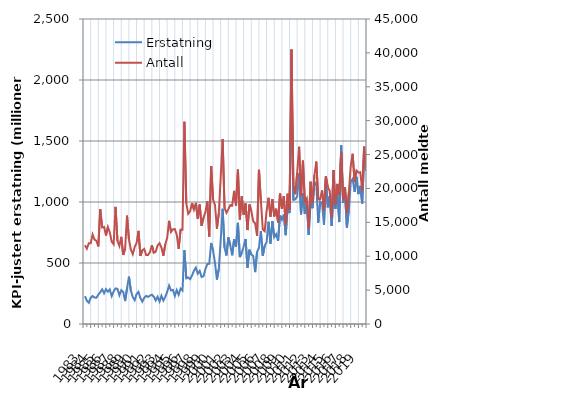
| Category | Erstatning |
|---|---|
| 1983.0 | 227.964 |
| nan | 190.955 |
| nan | 174.628 |
| nan | 213.912 |
| 1984.0 | 229.384 |
| nan | 216.981 |
| nan | 215.133 |
| nan | 240.627 |
| 1985.0 | 260.029 |
| nan | 284.219 |
| nan | 251.852 |
| nan | 285.634 |
| 1986.0 | 264.826 |
| nan | 283.375 |
| nan | 228.079 |
| nan | 266.905 |
| 1987.0 | 291.588 |
| nan | 287.744 |
| nan | 235.473 |
| nan | 277.041 |
| 1988.0 | 263.687 |
| nan | 187.968 |
| nan | 292.765 |
| nan | 387.832 |
| 1989.0 | 273.994 |
| nan | 221.453 |
| nan | 194.861 |
| nan | 245.838 |
| 1990.0 | 263.228 |
| nan | 211.767 |
| nan | 183.659 |
| nan | 213.772 |
| 1991.0 | 230.68 |
| nan | 221.798 |
| nan | 232.127 |
| nan | 239.99 |
| 1992.0 | 224.195 |
| nan | 193.179 |
| nan | 223.213 |
| nan | 184.195 |
| 1993.0 | 231.114 |
| nan | 192.338 |
| nan | 222.213 |
| nan | 262.884 |
| 1994.0 | 314.862 |
| nan | 275.261 |
| nan | 279.662 |
| nan | 230.511 |
| 1995.0 | 277.717 |
| nan | 238.919 |
| nan | 290.312 |
| nan | 275.636 |
| 1996.0 | 604.469 |
| nan | 374.297 |
| nan | 380.984 |
| nan | 367.429 |
| 1997.0 | 397.775 |
| nan | 436.49 |
| nan | 462.248 |
| nan | 412.432 |
| 1998.0 | 435.106 |
| nan | 385.462 |
| nan | 391.76 |
| nan | 450.284 |
| 1999.0 | 491.13 |
| nan | 493.516 |
| nan | 664.088 |
| nan | 601.42 |
| 2000.0 | 501.324 |
| nan | 364.071 |
| nan | 451.345 |
| nan | 688.162 |
| 2001.0 | 944.423 |
| nan | 625.212 |
| nan | 561.523 |
| nan | 710.442 |
| 2002.0 | 647.039 |
| nan | 562.987 |
| nan | 695.755 |
| nan | 633.988 |
| 2003.0 | 829.17 |
| nan | 548.217 |
| nan | 583.233 |
| nan | 635.347 |
| 2004.0 | 697.01 |
| nan | 460.816 |
| nan | 609.217 |
| nan | 569.431 |
| 2005.0 | 557.333 |
| nan | 425.322 |
| nan | 590.463 |
| nan | 625.742 |
| 2006.0 | 760.6 |
| nan | 557.795 |
| nan | 641.812 |
| nan | 669.588 |
| 2007.0 | 838.122 |
| nan | 658.941 |
| nan | 841.908 |
| nan | 711.817 |
| 2008.0 | 736.112 |
| nan | 681.454 |
| nan | 890.019 |
| nan | 854.771 |
| 2009.0 | 896.987 |
| nan | 728.211 |
| nan | 961.947 |
| nan | 909.241 |
| 2010.0 | 1994.506 |
| nan | 1017.297 |
| nan | 1022.191 |
| nan | 1045.745 |
| 2011.0 | 1235.879 |
| nan | 898.702 |
| nan | 1071.564 |
| nan | 903.076 |
| 2012.0 | 1000.485 |
| nan | 731.446 |
| nan | 1008.459 |
| nan | 949.56 |
| 2013.0 | 1166.159 |
| nan | 1141.89 |
| nan | 830.891 |
| nan | 1003.62 |
| 2014.0 | 989.839 |
| nan | 812.853 |
| nan | 1195.75 |
| nan | 956.074 |
| 2015.0 | 1048.937 |
| nan | 803.302 |
| nan | 1063.343 |
| nan | 944.127 |
| 2016.0 | 1085.348 |
| nan | 835.433 |
| nan | 1465.2 |
| nan | 994.139 |
| 2017.0 | 1065.703 |
| nan | 790.406 |
| nan | 933.477 |
| nan | 1165.604 |
| 2018.0 | 1189.913 |
| nan | 1082.504 |
| nan | 1206.617 |
| nan | 1064.589 |
| 2019.0 | 1132.439 |
| nan | 987.405 |
| nan | 1374.247 |
| nan | 1279.808 |